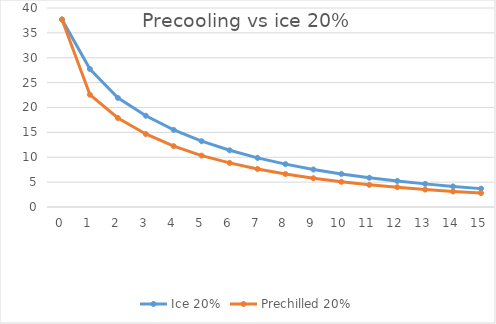
| Category | Ice 20% | Prechilled 20% |
|---|---|---|
| 0 | 37.7 | 37.7 |
| 1 | 27.74 | 22.567 |
| 2 | 21.94 | 17.896 |
| 3 | 18.347 | 14.676 |
| 4 | 15.504 | 12.226 |
| 5 | 13.223 | 10.336 |
| 6 | 11.4 | 8.863 |
| 7 | 9.875 | 7.648 |
| 8 | 8.619 | 6.629 |
| 9 | 7.543 | 5.776 |
| 10 | 6.654 | 5.06 |
| 11 | 5.879 | 4.455 |
| 12 | 5.22 | 3.983 |
| 13 | 4.649 | 3.502 |
| 14 | 4.138 | 3.123 |
| 15 | 3.693 | 2.798 |